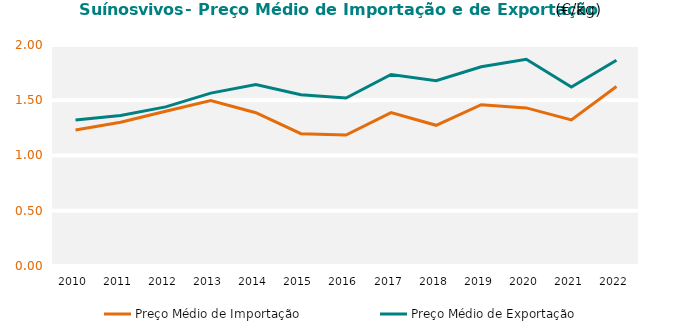
| Category | Preço Médio de Importação | Preço Médio de Exportação |
|---|---|---|
| 2010.0 | 1.231 | 1.321 |
| 2011.0 | 1.301 | 1.362 |
| 2012.0 | 1.401 | 1.44 |
| 2013.0 | 1.497 | 1.565 |
| 2014.0 | 1.387 | 1.642 |
| 2015.0 | 1.198 | 1.55 |
| 2016.0 | 1.185 | 1.52 |
| 2017.0 | 1.389 | 1.733 |
| 2018.0 | 1.273 | 1.677 |
| 2019.0 | 1.46 | 1.803 |
| 2020.0 | 1.431 | 1.871 |
| 2021.0 | 1.322 | 1.619 |
| 2022.0 | 1.625 | 1.863 |